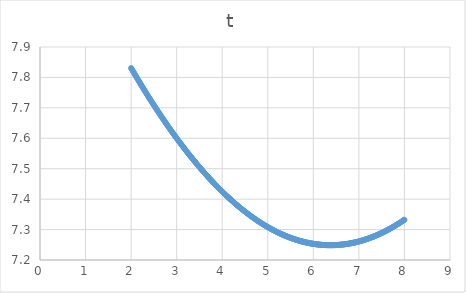
| Category | t |
|---|---|
| 2.0 | 7.831 |
| 2.012 | 7.828 |
| 2.024 | 7.825 |
| 2.036 | 7.822 |
| 2.048 | 7.819 |
| 2.06 | 7.816 |
| 2.072 | 7.813 |
| 2.084 | 7.81 |
| 2.096 | 7.806 |
| 2.108 | 7.803 |
| 2.12 | 7.8 |
| 2.132 | 7.797 |
| 2.144 | 7.794 |
| 2.156 | 7.791 |
| 2.168 | 7.788 |
| 2.18 | 7.785 |
| 2.192 | 7.783 |
| 2.204 | 7.78 |
| 2.216 | 7.777 |
| 2.228 | 7.774 |
| 2.24 | 7.771 |
| 2.2520000000000002 | 7.768 |
| 2.2640000000000002 | 7.765 |
| 2.2760000000000002 | 7.762 |
| 2.2880000000000003 | 7.759 |
| 2.3000000000000003 | 7.756 |
| 2.3120000000000003 | 7.753 |
| 2.3240000000000003 | 7.75 |
| 2.3360000000000003 | 7.747 |
| 2.3480000000000003 | 7.745 |
| 2.3600000000000003 | 7.742 |
| 2.3720000000000003 | 7.739 |
| 2.3840000000000003 | 7.736 |
| 2.3960000000000004 | 7.733 |
| 2.4080000000000004 | 7.73 |
| 2.4200000000000004 | 7.728 |
| 2.4320000000000004 | 7.725 |
| 2.4440000000000004 | 7.722 |
| 2.4560000000000004 | 7.719 |
| 2.4680000000000004 | 7.716 |
| 2.4800000000000004 | 7.713 |
| 2.4920000000000004 | 7.711 |
| 2.5040000000000004 | 7.708 |
| 2.5160000000000005 | 7.705 |
| 2.5280000000000005 | 7.702 |
| 2.5400000000000005 | 7.7 |
| 2.5520000000000005 | 7.697 |
| 2.5640000000000005 | 7.694 |
| 2.5760000000000005 | 7.691 |
| 2.5880000000000005 | 7.689 |
| 2.6000000000000005 | 7.686 |
| 2.6120000000000005 | 7.683 |
| 2.6240000000000006 | 7.681 |
| 2.6360000000000006 | 7.678 |
| 2.6480000000000006 | 7.675 |
| 2.6600000000000006 | 7.673 |
| 2.6720000000000006 | 7.67 |
| 2.6840000000000006 | 7.667 |
| 2.6960000000000006 | 7.665 |
| 2.7080000000000006 | 7.662 |
| 2.7200000000000006 | 7.659 |
| 2.7320000000000007 | 7.657 |
| 2.7440000000000007 | 7.654 |
| 2.7560000000000007 | 7.651 |
| 2.7680000000000007 | 7.649 |
| 2.7800000000000007 | 7.646 |
| 2.7920000000000007 | 7.644 |
| 2.8040000000000007 | 7.641 |
| 2.8160000000000007 | 7.639 |
| 2.8280000000000007 | 7.636 |
| 2.8400000000000007 | 7.633 |
| 2.8520000000000008 | 7.631 |
| 2.8640000000000008 | 7.628 |
| 2.876000000000001 | 7.626 |
| 2.888000000000001 | 7.623 |
| 2.900000000000001 | 7.621 |
| 2.912000000000001 | 7.618 |
| 2.924000000000001 | 7.616 |
| 2.936000000000001 | 7.613 |
| 2.948000000000001 | 7.611 |
| 2.960000000000001 | 7.608 |
| 2.972000000000001 | 7.606 |
| 2.984000000000001 | 7.603 |
| 2.996000000000001 | 7.601 |
| 3.008000000000001 | 7.599 |
| 3.020000000000001 | 7.596 |
| 3.032000000000001 | 7.594 |
| 3.044000000000001 | 7.591 |
| 3.056000000000001 | 7.589 |
| 3.068000000000001 | 7.586 |
| 3.080000000000001 | 7.584 |
| 3.092000000000001 | 7.582 |
| 3.104000000000001 | 7.579 |
| 3.116000000000001 | 7.577 |
| 3.128000000000001 | 7.575 |
| 3.140000000000001 | 7.572 |
| 3.152000000000001 | 7.57 |
| 3.164000000000001 | 7.567 |
| 3.176000000000001 | 7.565 |
| 3.188000000000001 | 7.563 |
| 3.200000000000001 | 7.561 |
| 3.212000000000001 | 7.558 |
| 3.224000000000001 | 7.556 |
| 3.236000000000001 | 7.554 |
| 3.248000000000001 | 7.551 |
| 3.260000000000001 | 7.549 |
| 3.272000000000001 | 7.547 |
| 3.284000000000001 | 7.545 |
| 3.296000000000001 | 7.542 |
| 3.308000000000001 | 7.54 |
| 3.320000000000001 | 7.538 |
| 3.332000000000001 | 7.536 |
| 3.344000000000001 | 7.533 |
| 3.356000000000001 | 7.531 |
| 3.368000000000001 | 7.529 |
| 3.3800000000000012 | 7.527 |
| 3.3920000000000012 | 7.525 |
| 3.4040000000000012 | 7.522 |
| 3.4160000000000013 | 7.52 |
| 3.4280000000000013 | 7.518 |
| 3.4400000000000013 | 7.516 |
| 3.4520000000000013 | 7.514 |
| 3.4640000000000013 | 7.512 |
| 3.4760000000000013 | 7.51 |
| 3.4880000000000013 | 7.507 |
| 3.5000000000000013 | 7.505 |
| 3.5120000000000013 | 7.503 |
| 3.5240000000000014 | 7.501 |
| 3.5360000000000014 | 7.499 |
| 3.5480000000000014 | 7.497 |
| 3.5600000000000014 | 7.495 |
| 3.5720000000000014 | 7.493 |
| 3.5840000000000014 | 7.491 |
| 3.5960000000000014 | 7.489 |
| 3.6080000000000014 | 7.487 |
| 3.6200000000000014 | 7.485 |
| 3.6320000000000014 | 7.483 |
| 3.6440000000000015 | 7.481 |
| 3.6560000000000015 | 7.479 |
| 3.6680000000000015 | 7.477 |
| 3.6800000000000015 | 7.475 |
| 3.6920000000000015 | 7.473 |
| 3.7040000000000015 | 7.471 |
| 3.7160000000000015 | 7.469 |
| 3.7280000000000015 | 7.467 |
| 3.7400000000000015 | 7.465 |
| 3.7520000000000016 | 7.463 |
| 3.7640000000000016 | 7.461 |
| 3.7760000000000016 | 7.459 |
| 3.7880000000000016 | 7.457 |
| 3.8000000000000016 | 7.455 |
| 3.8120000000000016 | 7.453 |
| 3.8240000000000016 | 7.451 |
| 3.8360000000000016 | 7.45 |
| 3.8480000000000016 | 7.448 |
| 3.8600000000000017 | 7.446 |
| 3.8720000000000017 | 7.444 |
| 3.8840000000000017 | 7.442 |
| 3.8960000000000017 | 7.44 |
| 3.9080000000000017 | 7.438 |
| 3.9200000000000017 | 7.437 |
| 3.9320000000000017 | 7.435 |
| 3.9440000000000017 | 7.433 |
| 3.9560000000000017 | 7.431 |
| 3.9680000000000017 | 7.429 |
| 3.9800000000000018 | 7.428 |
| 3.9920000000000018 | 7.426 |
| 4.004000000000001 | 7.424 |
| 4.016000000000001 | 7.422 |
| 4.0280000000000005 | 7.421 |
| 4.04 | 7.419 |
| 4.052 | 7.417 |
| 4.063999999999999 | 7.416 |
| 4.075999999999999 | 7.414 |
| 4.087999999999998 | 7.412 |
| 4.099999999999998 | 7.41 |
| 4.111999999999997 | 7.409 |
| 4.123999999999997 | 7.407 |
| 4.135999999999997 | 7.405 |
| 4.147999999999996 | 7.404 |
| 4.159999999999996 | 7.402 |
| 4.171999999999995 | 7.4 |
| 4.183999999999995 | 7.399 |
| 4.195999999999994 | 7.397 |
| 4.207999999999994 | 7.396 |
| 4.2199999999999935 | 7.394 |
| 4.231999999999993 | 7.392 |
| 4.243999999999993 | 7.391 |
| 4.255999999999992 | 7.389 |
| 4.267999999999992 | 7.388 |
| 4.279999999999991 | 7.386 |
| 4.291999999999991 | 7.385 |
| 4.3039999999999905 | 7.383 |
| 4.31599999999999 | 7.381 |
| 4.32799999999999 | 7.38 |
| 4.339999999999989 | 7.378 |
| 4.351999999999989 | 7.377 |
| 4.363999999999988 | 7.375 |
| 4.375999999999988 | 7.374 |
| 4.3879999999999875 | 7.372 |
| 4.399999999999987 | 7.371 |
| 4.411999999999987 | 7.369 |
| 4.423999999999986 | 7.368 |
| 4.435999999999986 | 7.367 |
| 4.447999999999985 | 7.365 |
| 4.459999999999985 | 7.364 |
| 4.471999999999984 | 7.362 |
| 4.483999999999984 | 7.361 |
| 4.495999999999984 | 7.359 |
| 4.507999999999983 | 7.358 |
| 4.519999999999983 | 7.357 |
| 4.531999999999982 | 7.355 |
| 4.543999999999982 | 7.354 |
| 4.555999999999981 | 7.353 |
| 4.567999999999981 | 7.351 |
| 4.5799999999999805 | 7.35 |
| 4.59199999999998 | 7.348 |
| 4.60399999999998 | 7.347 |
| 4.615999999999979 | 7.346 |
| 4.627999999999979 | 7.345 |
| 4.639999999999978 | 7.343 |
| 4.651999999999978 | 7.342 |
| 4.6639999999999775 | 7.341 |
| 4.675999999999977 | 7.339 |
| 4.687999999999977 | 7.338 |
| 4.699999999999976 | 7.337 |
| 4.711999999999976 | 7.336 |
| 4.723999999999975 | 7.334 |
| 4.735999999999975 | 7.333 |
| 4.7479999999999745 | 7.332 |
| 4.759999999999974 | 7.331 |
| 4.771999999999974 | 7.329 |
| 4.783999999999973 | 7.328 |
| 4.795999999999973 | 7.327 |
| 4.807999999999972 | 7.326 |
| 4.819999999999972 | 7.325 |
| 4.831999999999971 | 7.324 |
| 4.843999999999971 | 7.322 |
| 4.855999999999971 | 7.321 |
| 4.86799999999997 | 7.32 |
| 4.87999999999997 | 7.319 |
| 4.891999999999969 | 7.318 |
| 4.903999999999969 | 7.317 |
| 4.915999999999968 | 7.316 |
| 4.927999999999968 | 7.315 |
| 4.9399999999999675 | 7.313 |
| 4.951999999999967 | 7.312 |
| 4.963999999999967 | 7.311 |
| 4.975999999999966 | 7.31 |
| 4.987999999999966 | 7.309 |
| 4.999999999999965 | 7.308 |
| 5.011999999999965 | 7.307 |
| 5.0239999999999645 | 7.306 |
| 5.035999999999964 | 7.305 |
| 5.047999999999964 | 7.304 |
| 5.059999999999963 | 7.303 |
| 5.071999999999963 | 7.302 |
| 5.083999999999962 | 7.301 |
| 5.095999999999962 | 7.3 |
| 5.1079999999999615 | 7.299 |
| 5.119999999999961 | 7.298 |
| 5.131999999999961 | 7.297 |
| 5.14399999999996 | 7.296 |
| 5.15599999999996 | 7.296 |
| 5.167999999999959 | 7.295 |
| 5.179999999999959 | 7.294 |
| 5.191999999999958 | 7.293 |
| 5.203999999999958 | 7.292 |
| 5.215999999999958 | 7.291 |
| 5.227999999999957 | 7.29 |
| 5.239999999999957 | 7.289 |
| 5.251999999999956 | 7.288 |
| 5.263999999999956 | 7.288 |
| 5.275999999999955 | 7.287 |
| 5.287999999999955 | 7.286 |
| 5.2999999999999545 | 7.285 |
| 5.311999999999954 | 7.284 |
| 5.323999999999954 | 7.284 |
| 5.335999999999953 | 7.283 |
| 5.347999999999953 | 7.282 |
| 5.359999999999952 | 7.281 |
| 5.371999999999952 | 7.28 |
| 5.3839999999999515 | 7.28 |
| 5.395999999999951 | 7.279 |
| 5.407999999999951 | 7.278 |
| 5.41999999999995 | 7.277 |
| 5.43199999999995 | 7.277 |
| 5.443999999999949 | 7.276 |
| 5.455999999999949 | 7.275 |
| 5.4679999999999485 | 7.275 |
| 5.479999999999948 | 7.274 |
| 5.491999999999948 | 7.273 |
| 5.503999999999947 | 7.273 |
| 5.515999999999947 | 7.272 |
| 5.527999999999946 | 7.271 |
| 5.539999999999946 | 7.271 |
| 5.551999999999945 | 7.27 |
| 5.563999999999945 | 7.269 |
| 5.575999999999945 | 7.269 |
| 5.587999999999944 | 7.268 |
| 5.599999999999944 | 7.268 |
| 5.611999999999943 | 7.267 |
| 5.623999999999943 | 7.266 |
| 5.635999999999942 | 7.266 |
| 5.647999999999942 | 7.265 |
| 5.6599999999999415 | 7.265 |
| 5.671999999999941 | 7.264 |
| 5.683999999999941 | 7.264 |
| 5.69599999999994 | 7.263 |
| 5.70799999999994 | 7.263 |
| 5.719999999999939 | 7.262 |
| 5.731999999999939 | 7.262 |
| 5.7439999999999385 | 7.261 |
| 5.755999999999938 | 7.261 |
| 5.767999999999938 | 7.26 |
| 5.779999999999937 | 7.26 |
| 5.791999999999937 | 7.259 |
| 5.803999999999936 | 7.259 |
| 5.815999999999936 | 7.259 |
| 5.8279999999999355 | 7.258 |
| 5.839999999999935 | 7.258 |
| 5.851999999999935 | 7.257 |
| 5.863999999999934 | 7.257 |
| 5.875999999999934 | 7.257 |
| 5.887999999999933 | 7.256 |
| 5.899999999999933 | 7.256 |
| 5.911999999999932 | 7.255 |
| 5.923999999999932 | 7.255 |
| 5.9359999999999316 | 7.255 |
| 5.947999999999931 | 7.254 |
| 5.959999999999931 | 7.254 |
| 5.97199999999993 | 7.254 |
| 5.98399999999993 | 7.253 |
| 5.995999999999929 | 7.253 |
| 6.007999999999929 | 7.253 |
| 6.0199999999999285 | 7.253 |
| 6.031999999999928 | 7.252 |
| 6.043999999999928 | 7.252 |
| 6.055999999999927 | 7.252 |
| 6.067999999999927 | 7.252 |
| 6.079999999999926 | 7.251 |
| 6.091999999999926 | 7.251 |
| 6.1039999999999255 | 7.251 |
| 6.115999999999925 | 7.251 |
| 6.127999999999925 | 7.251 |
| 6.139999999999924 | 7.25 |
| 6.151999999999924 | 7.25 |
| 6.163999999999923 | 7.25 |
| 6.175999999999923 | 7.25 |
| 6.1879999999999225 | 7.25 |
| 6.199999999999922 | 7.25 |
| 6.211999999999922 | 7.249 |
| 6.223999999999921 | 7.249 |
| 6.235999999999921 | 7.249 |
| 6.24799999999992 | 7.249 |
| 6.25999999999992 | 7.249 |
| 6.271999999999919 | 7.249 |
| 6.283999999999919 | 7.249 |
| 6.2959999999999186 | 7.249 |
| 6.307999999999918 | 7.249 |
| 6.319999999999918 | 7.249 |
| 6.331999999999917 | 7.249 |
| 6.343999999999917 | 7.249 |
| 6.355999999999916 | 7.249 |
| 6.367999999999916 | 7.249 |
| 6.3799999999999155 | 7.249 |
| 6.391999999999915 | 7.249 |
| 6.403999999999915 | 7.249 |
| 6.415999999999914 | 7.249 |
| 6.427999999999914 | 7.249 |
| 6.439999999999913 | 7.249 |
| 6.451999999999913 | 7.249 |
| 6.4639999999999125 | 7.249 |
| 6.475999999999912 | 7.249 |
| 6.487999999999912 | 7.249 |
| 6.499999999999911 | 7.249 |
| 6.511999999999911 | 7.249 |
| 6.52399999999991 | 7.249 |
| 6.53599999999991 | 7.249 |
| 6.5479999999999094 | 7.25 |
| 6.559999999999909 | 7.25 |
| 6.571999999999909 | 7.25 |
| 6.583999999999908 | 7.25 |
| 6.595999999999908 | 7.25 |
| 6.607999999999907 | 7.25 |
| 6.619999999999907 | 7.251 |
| 6.631999999999906 | 7.251 |
| 6.643999999999906 | 7.251 |
| 6.6559999999999055 | 7.251 |
| 6.667999999999905 | 7.251 |
| 6.679999999999905 | 7.252 |
| 6.691999999999904 | 7.252 |
| 6.703999999999904 | 7.252 |
| 6.715999999999903 | 7.252 |
| 6.727999999999903 | 7.253 |
| 6.7399999999999025 | 7.253 |
| 6.751999999999902 | 7.253 |
| 6.763999999999902 | 7.253 |
| 6.775999999999901 | 7.254 |
| 6.787999999999901 | 7.254 |
| 6.7999999999999 | 7.254 |
| 6.8119999999999 | 7.255 |
| 6.8239999999998995 | 7.255 |
| 6.835999999999899 | 7.255 |
| 6.847999999999899 | 7.256 |
| 6.859999999999898 | 7.256 |
| 6.871999999999898 | 7.256 |
| 6.883999999999897 | 7.257 |
| 6.895999999999897 | 7.257 |
| 6.9079999999998964 | 7.258 |
| 6.919999999999896 | 7.258 |
| 6.931999999999896 | 7.258 |
| 6.943999999999895 | 7.259 |
| 6.955999999999895 | 7.259 |
| 6.967999999999894 | 7.26 |
| 6.979999999999894 | 7.26 |
| 6.991999999999893 | 7.261 |
| 7.003999999999893 | 7.261 |
| 7.0159999999998925 | 7.262 |
| 7.027999999999892 | 7.262 |
| 7.039999999999892 | 7.263 |
| 7.051999999999891 | 7.263 |
| 7.063999999999891 | 7.264 |
| 7.07599999999989 | 7.264 |
| 7.08799999999989 | 7.265 |
| 7.0999999999998895 | 7.265 |
| 7.111999999999889 | 7.266 |
| 7.123999999999889 | 7.266 |
| 7.135999999999888 | 7.267 |
| 7.147999999999888 | 7.268 |
| 7.159999999999887 | 7.268 |
| 7.171999999999887 | 7.269 |
| 7.1839999999998865 | 7.269 |
| 7.195999999999886 | 7.27 |
| 7.207999999999886 | 7.271 |
| 7.219999999999885 | 7.271 |
| 7.231999999999885 | 7.272 |
| 7.243999999999884 | 7.273 |
| 7.255999999999884 | 7.273 |
| 7.267999999999883 | 7.274 |
| 7.279999999999883 | 7.275 |
| 7.291999999999883 | 7.275 |
| 7.303999999999882 | 7.276 |
| 7.315999999999882 | 7.277 |
| 7.327999999999881 | 7.277 |
| 7.339999999999881 | 7.278 |
| 7.35199999999988 | 7.279 |
| 7.36399999999988 | 7.28 |
| 7.3759999999998795 | 7.28 |
| 7.387999999999879 | 7.281 |
| 7.399999999999879 | 7.282 |
| 7.411999999999878 | 7.283 |
| 7.423999999999878 | 7.284 |
| 7.435999999999877 | 7.284 |
| 7.447999999999877 | 7.285 |
| 7.4599999999998765 | 7.286 |
| 7.471999999999876 | 7.287 |
| 7.483999999999876 | 7.288 |
| 7.495999999999875 | 7.289 |
| 7.507999999999875 | 7.289 |
| 7.519999999999874 | 7.29 |
| 7.531999999999874 | 7.291 |
| 7.5439999999998735 | 7.292 |
| 7.555999999999873 | 7.293 |
| 7.567999999999873 | 7.294 |
| 7.579999999999872 | 7.295 |
| 7.591999999999872 | 7.296 |
| 7.603999999999871 | 7.297 |
| 7.615999999999871 | 7.297 |
| 7.62799999999987 | 7.298 |
| 7.63999999999987 | 7.299 |
| 7.65199999999987 | 7.3 |
| 7.663999999999869 | 7.301 |
| 7.675999999999869 | 7.302 |
| 7.687999999999868 | 7.303 |
| 7.699999999999868 | 7.304 |
| 7.711999999999867 | 7.305 |
| 7.723999999999867 | 7.306 |
| 7.7359999999998665 | 7.307 |
| 7.747999999999866 | 7.308 |
| 7.759999999999866 | 7.309 |
| 7.771999999999865 | 7.311 |
| 7.783999999999865 | 7.312 |
| 7.795999999999864 | 7.313 |
| 7.807999999999864 | 7.314 |
| 7.8199999999998635 | 7.315 |
| 7.831999999999863 | 7.316 |
| 7.843999999999863 | 7.317 |
| 7.855999999999862 | 7.318 |
| 7.867999999999862 | 7.319 |
| 7.879999999999861 | 7.32 |
| 7.891999999999861 | 7.322 |
| 7.9039999999998605 | 7.323 |
| 7.91599999999986 | 7.324 |
| 7.92799999999986 | 7.325 |
| 7.939999999999859 | 7.326 |
| 7.951999999999859 | 7.328 |
| 7.963999999999858 | 7.329 |
| 7.975999999999858 | 7.33 |
| 7.987999999999857 | 7.331 |
| 7.999999999999857 | 7.332 |